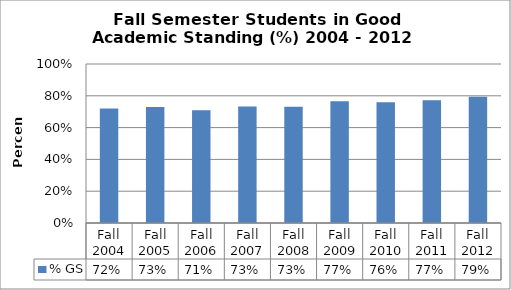
| Category | % GS |
|---|---|
| Fall 2004 | 0.72 |
| Fall 2005 | 0.729 |
| Fall 2006 | 0.71 |
| Fall 2007 | 0.733 |
| Fall 2008 | 0.73 |
| Fall 2009 | 0.765 |
| Fall 2010 | 0.759 |
| Fall 2011 | 0.772 |
| Fall 2012 | 0.793 |